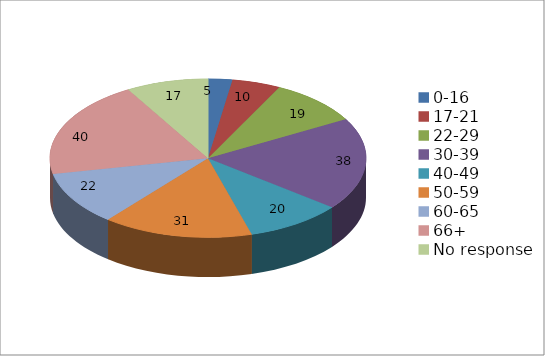
| Category | Series 0 |
|---|---|
| 0-16 | 5 |
| 17-21 | 10 |
| 22-29 | 19 |
| 30-39 | 38 |
| 40-49 | 20 |
| 50-59 | 31 |
| 60-65 | 22 |
| 66+ | 40 |
| No response | 17 |